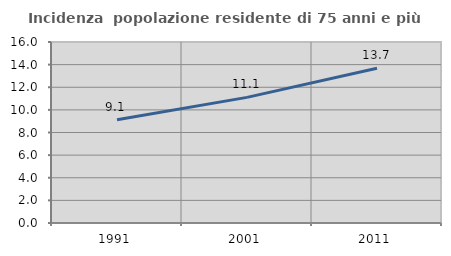
| Category | Incidenza  popolazione residente di 75 anni e più |
|---|---|
| 1991.0 | 9.13 |
| 2001.0 | 11.103 |
| 2011.0 | 13.674 |